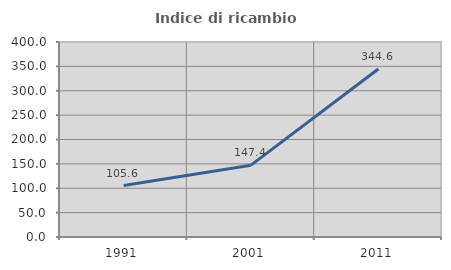
| Category | Indice di ricambio occupazionale  |
|---|---|
| 1991.0 | 105.636 |
| 2001.0 | 147.387 |
| 2011.0 | 344.648 |